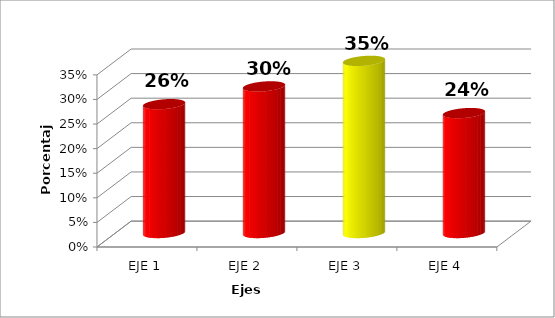
| Category | Series 0 |
|---|---|
| EJE 1 | 0.262 |
| EJE 2 | 0.298 |
| EJE 3 | 0.35 |
| EJE 4 | 0.244 |